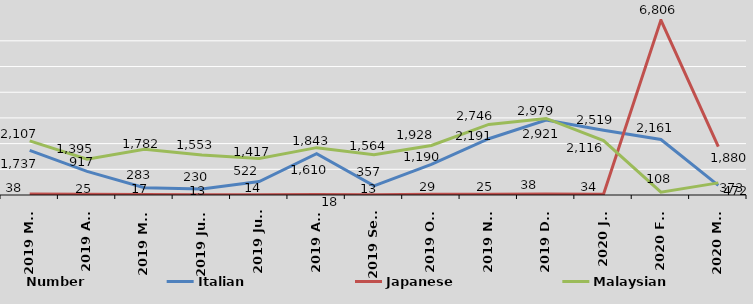
| Category | Italian | Japanese |
|---|---|---|
| 2019 Mar | 1737 | 38 |
| 2019 Apr | 917 | 25 |
| 2019 May | 283 | 17 |
| 2019 June | 230 | 13 |
| 2019 July | 522 | 14 |
| 2019 Aug | 1610 | 18 |
| 2019 Sept | 357 | 13 |
| 2019 Oct | 1190 | 29 |
| 2019 Nov | 2191 | 25 |
| 2019 Dec | 2921 | 38 |
| 2020 Jan | 2519 | 34 |
| 2020 Feb | 2161 | 6806 |
| 2020 Mar | 373 | 1880 |